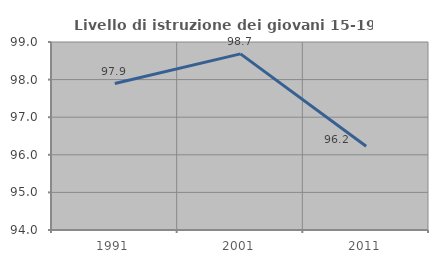
| Category | Livello di istruzione dei giovani 15-19 anni |
|---|---|
| 1991.0 | 97.895 |
| 2001.0 | 98.684 |
| 2011.0 | 96.226 |